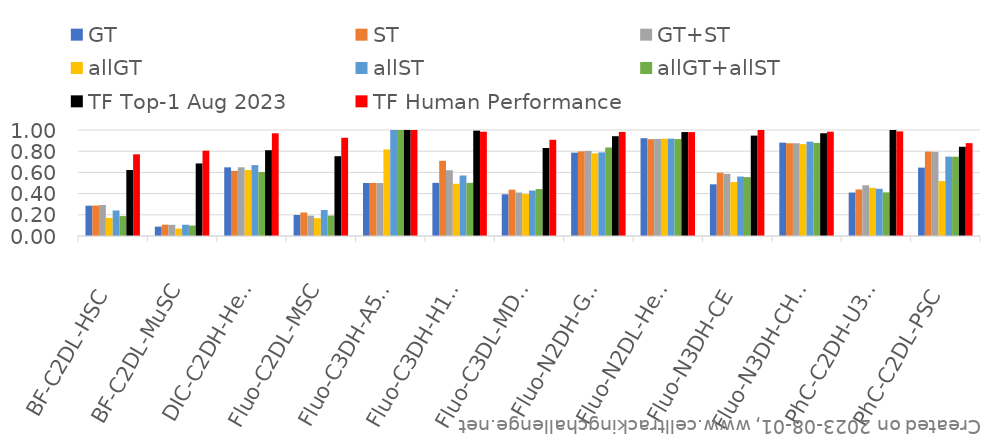
| Category | GT | ST | GT+ST | allGT | allST | allGT+allST | TF Top-1 Aug 2023 | TF Human Performance |
|---|---|---|---|---|---|---|---|---|
| BF-C2DL-HSC | 0.286 | 0.287 | 0.292 | 0.171 | 0.241 | 0.188 | 0.623 | 0.77 |
| BF-C2DL-MuSC | 0.088 | 0.107 | 0.105 | 0.07 | 0.106 | 0.099 | 0.685 | 0.805 |
| DIC-C2DH-HeLa | 0.648 | 0.614 | 0.648 | 0.623 | 0.669 | 0.604 | 0.809 | 0.969 |
| Fluo-C2DL-MSC | 0.199 | 0.222 | 0.192 | 0.168 | 0.246 | 0.193 | 0.753 | 0.927 |
| Fluo-C3DH-A549 | 0.5 | 0.5 | 0.5 | 0.817 | 1 | 1 | 1 | 1 |
| Fluo-C3DH-H157 | 0.501 | 0.709 | 0.62 | 0.492 | 0.571 | 0.502 | 0.994 | 0.984 |
| Fluo-C3DL-MDA231 | 0.394 | 0.437 | 0.41 | 0.395 | 0.429 | 0.443 | 0.83 | 0.908 |
| Fluo-N2DH-GOWT1 | 0.786 | 0.798 | 0.803 | 0.78 | 0.789 | 0.835 | 0.942 | 0.982 |
| Fluo-N2DL-HeLa | 0.922 | 0.913 | 0.916 | 0.917 | 0.918 | 0.915 | 0.98 | 0.98 |
| Fluo-N3DH-CE | 0.488 | 0.597 | 0.586 | 0.509 | 0.561 | 0.555 | 0.947 | 1 |
| Fluo-N3DH-CHO | 0.881 | 0.875 | 0.875 | 0.867 | 0.89 | 0.878 | 0.969 | 0.984 |
| PhC-C2DH-U373 | 0.41 | 0.439 | 0.479 | 0.454 | 0.445 | 0.412 | 1 | 0.987 |
| PhC-C2DL-PSC | 0.645 | 0.796 | 0.794 | 0.518 | 0.749 | 0.748 | 0.842 | 0.876 |